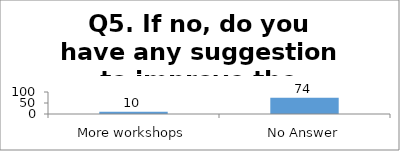
| Category | Q5. If no, do you have any suggestion to improve the quality of such session in future?  |
|---|---|
| More workshops | 10 |
| No Answer | 74 |